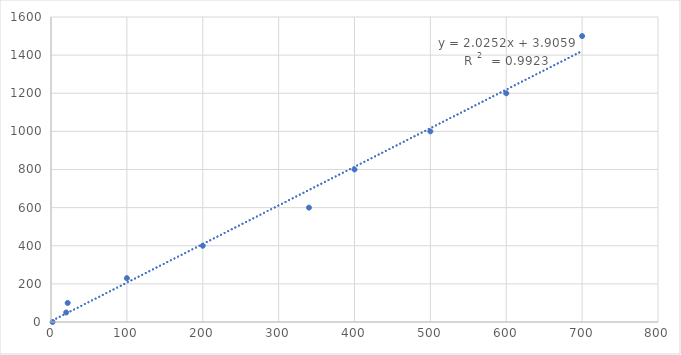
| Category | Concentration (microgram/mL) |
|---|---|
| 2.12 | 0 |
| 22.0 | 100 |
| 100.0 | 230 |
| 200.0 | 400 |
| 400.0 | 800 |
| 500.0 | 1000 |
| 340.0 | 600 |
| 20.0 | 50 |
| 600.0 | 1200 |
| 700.0 | 1500 |